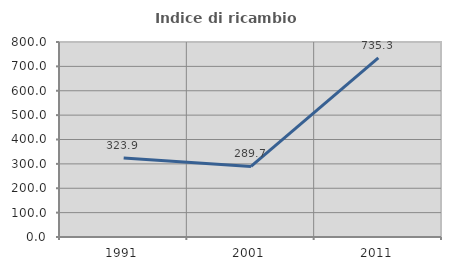
| Category | Indice di ricambio occupazionale  |
|---|---|
| 1991.0 | 323.913 |
| 2001.0 | 289.655 |
| 2011.0 | 735.294 |